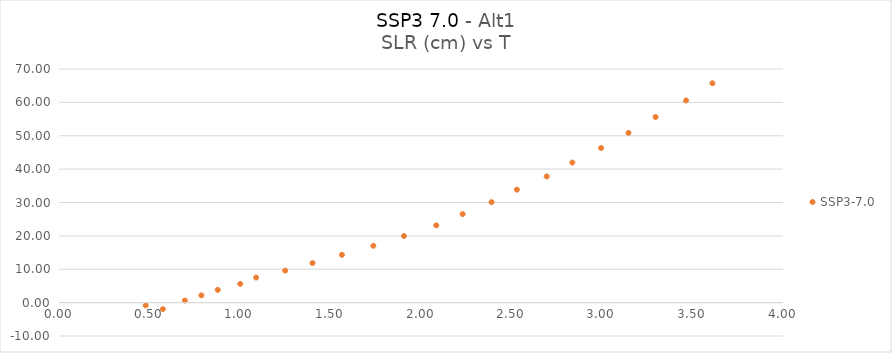
| Category | SSP3-7.0 |
|---|---|
| 0.573801925 | -1.941 |
| 0.479031654 | -0.818 |
| 0.695197934 | 0.621 |
| 0.786748548 | 2.18 |
| 0.877021499 | 3.834 |
| 1.001520332 | 5.633 |
| 1.089128948 | 7.505 |
| 1.249789297 | 9.582 |
| 1.40090264 | 11.846 |
| 1.563168575 | 14.321 |
| 1.736543554 | 17.03 |
| 1.905838217 | 19.967 |
| 2.084394689 | 23.152 |
| 2.229933662 | 26.519 |
| 2.38967776 | 30.098 |
| 2.529689917 | 33.847 |
| 2.694394026 | 37.818 |
| 2.836346075 | 41.963 |
| 2.994961126 | 46.317 |
| 3.14629165 | 50.865 |
| 3.296183387 | 55.604 |
| 3.46436806 | 60.573 |
| 3.610149607 | 65.723 |